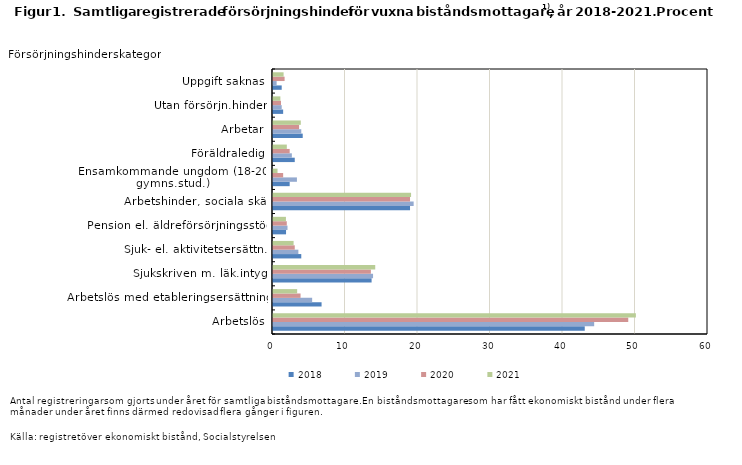
| Category | 2018 | 2019 | 2020 | 2021 |
|---|---|---|---|---|
| Arbetslös | 43 | 44.3 | 49 | 50.054 |
| Arbetslös med etableringsersättning | 6.7 | 5.4 | 3.8 | 3.333 |
| Sjukskriven m. läk.intyg | 13.6 | 13.8 | 13.5 | 14.102 |
| Sjuk- el. aktivitetsersättn. | 3.9 | 3.5 | 3 | 2.842 |
| Pension el. äldreförsörjningsstöd | 1.8 | 2 | 1.9 | 1.785 |
| Arbetshinder, sociala skäl | 18.9 | 19.4 | 18.9 | 19.044 |
| Ensamkommande ungdom (18-20, gymns.stud.) | 2.3 | 3.3 | 1.4 | 0.623 |
| Föräldraledig | 3 | 2.6 | 2.3 | 1.907 |
| Arbetar | 4.1 | 3.9 | 3.6 | 3.833 |
| Utan försörjn.hinder | 1.4 | 1.2 | 1.1 | 1.017 |
| Uppgift saknas | 1.2 | 0.5 | 1.6 | 1.461 |